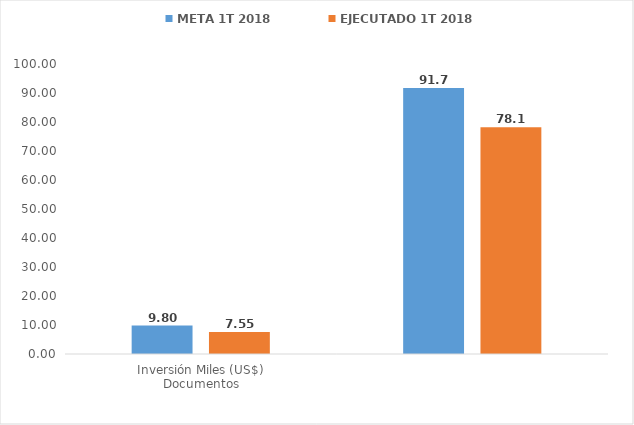
| Category | META 1T 2018 | EJECUTADO 1T 2018 |
|---|---|---|
| 0 | 9.8 | 7.55 |
| 1 | 91.745 | 78.149 |